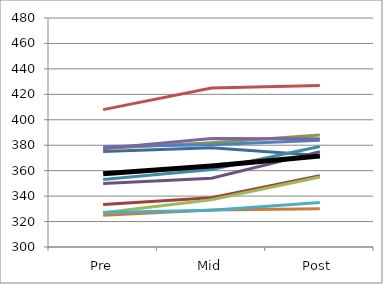
| Category | Series 0 | Series 1 | Series 2 | Series 3 | Series 4 | Series 5 | Series 6 | Series 7 | Series 8 | Series 9 | Series 10 | Mean |
|---|---|---|---|---|---|---|---|---|---|---|---|---|
| Pre | 375 | 333.333 | 377.5 | 350 | 353 | 325 | 379 | 408 | 327 | 377.5 | 327.083 | 357.492 |
| Mid | 378 | 338.75 | 382 | 354 | 361 | 329 | 380.417 | 425 | 337.083 | 385.208 | 328.958 | 363.583 |
| Post | 372 | 356 | 388 | 375 | 379 | 330 | 384 | 427 | 355 | 385 | 335 | 371.455 |